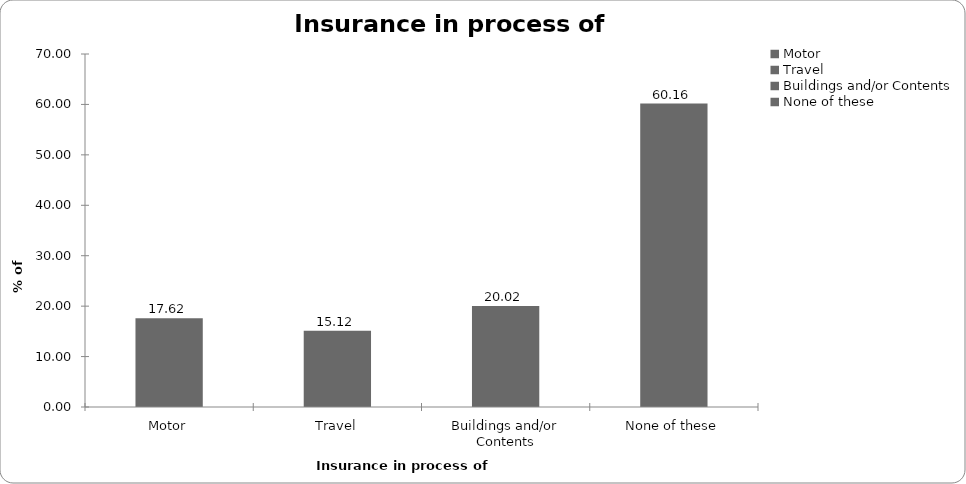
| Category | Insurance in process of buying |
|---|---|
| Motor | 17.618 |
| Travel | 15.115 |
| Buildings and/or Contents | 20.02 |
| None of these | 60.16 |